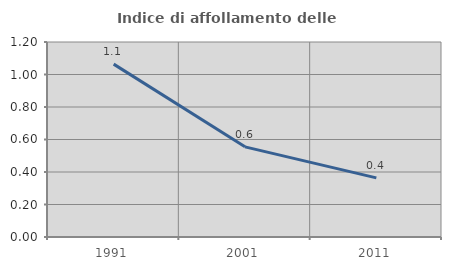
| Category | Indice di affollamento delle abitazioni  |
|---|---|
| 1991.0 | 1.064 |
| 2001.0 | 0.555 |
| 2011.0 | 0.364 |